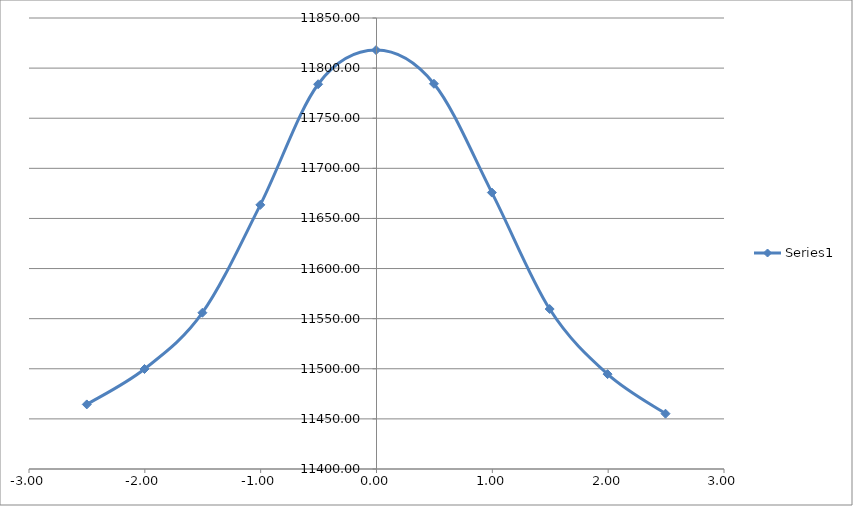
| Category | Series 0 |
|---|---|
| -2.5010000000000003 | 11464.436 |
| -2.003 | 11499.777 |
| -1.5030000000000001 | 11555.916 |
| -1.0030000000000001 | 11663.551 |
| -0.5040000000000004 | 11783.91 |
| -0.004000000000000448 | 11817.97 |
| 0.49599999999999955 | 11784.38 |
| 0.9959999999999996 | 11675.826 |
| 1.495 | 11559.622 |
| 1.995 | 11494.654 |
| 2.495 | 11455.171 |